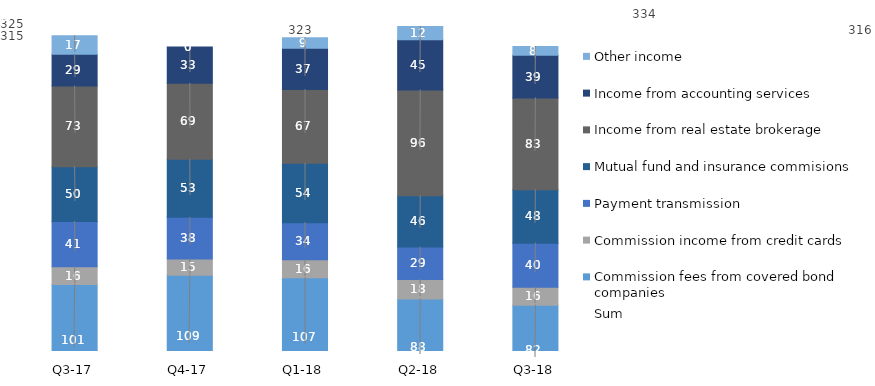
| Category | Commission fees from covered bond companies | Commission income from credit cards | Payment transmission | Mutual fund and insurance commisions | Income from real estate brokerage | Income from accounting services | Other income |
|---|---|---|---|---|---|---|---|
| Q3-18 | 81.9 | 16.26 | 39.73 | 48.31 | 82.95 | 38.5 | 7.99 |
| Q2-18 | 87.5 | 17.57 | 29.25 | 46.31 | 95.71 | 45.44 | 12 |
| Q1-18 | 106.7 | 16.1 | 33.6 | 53.7 | 66.6 | 37.3 | 9.4 |
| Q4-17 | 108.8 | 14.8 | 37.6 | 52.5 | 68.7 | 32.7 | 0 |
| Q3-17 | 100.5 | 16 | 41 | 49.5 | 72.9 | 28.6 | 16.9 |